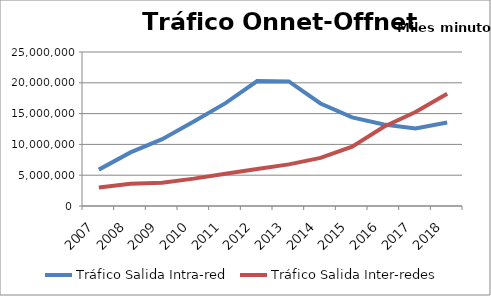
| Category | Tráfico Salida Intra-red | Tráfico Salida Inter-redes |
|---|---|---|
| 2007.0 | 5904083.795 | 3007133.407 |
| 2008.0 | 8700474.341 | 3605725.198 |
| 2009.0 | 10848127.978 | 3777186.553 |
| 2010.0 | 13731169.756 | 4442212.593 |
| 2011.0 | 16701623.385 | 5230021.942 |
| 2012.0 | 20281369.71 | 6022295.52 |
| 2013.0 | 20221752.311 | 6753941.544 |
| 2014.0 | 16638252.145 | 7814497.129 |
| 2015.0 | 14381121.54 | 9633316.484 |
| 2016.0 | 13225230.314 | 12856929.179 |
| 2017.0 | 12578132.761 | 15268259.097 |
| 2018.0 | 13561366.511 | 18231708.333 |